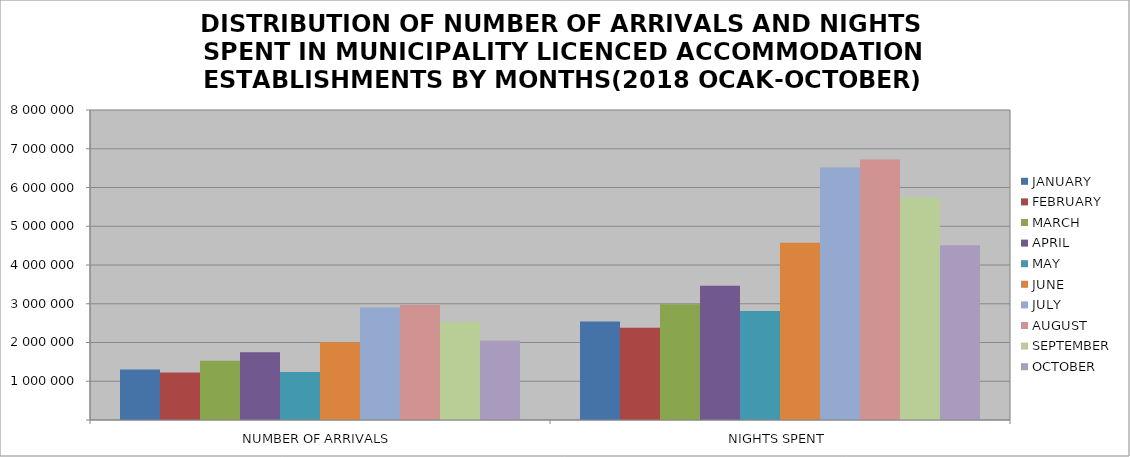
| Category | JANUARY | FEBRUARY | MARCH | APRIL | MAY | JUNE | JULY | AUGUST | SEPTEMBER | OCTOBER |
|---|---|---|---|---|---|---|---|---|---|---|
| NUMBER OF ARRIVALS | 1303353 | 1223475 | 1526172 | 1749085 | 1240889 | 2003881 | 2904028 | 2966995 | 2525986 | 2049336 |
| NIGHTS SPENT | 2542103 | 2381300 | 2986820 | 3463261 | 2810808 | 4572629 | 6517690 | 6721558 | 5740112 | 4508357 |